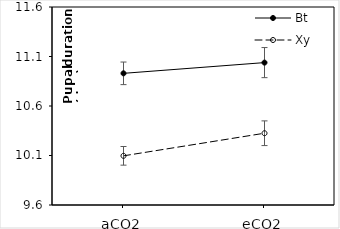
| Category | Bt | Xy |
|---|---|---|
| aCO2 | 10.93 | 10.097 |
| eCO2 | 11.038 | 10.325 |